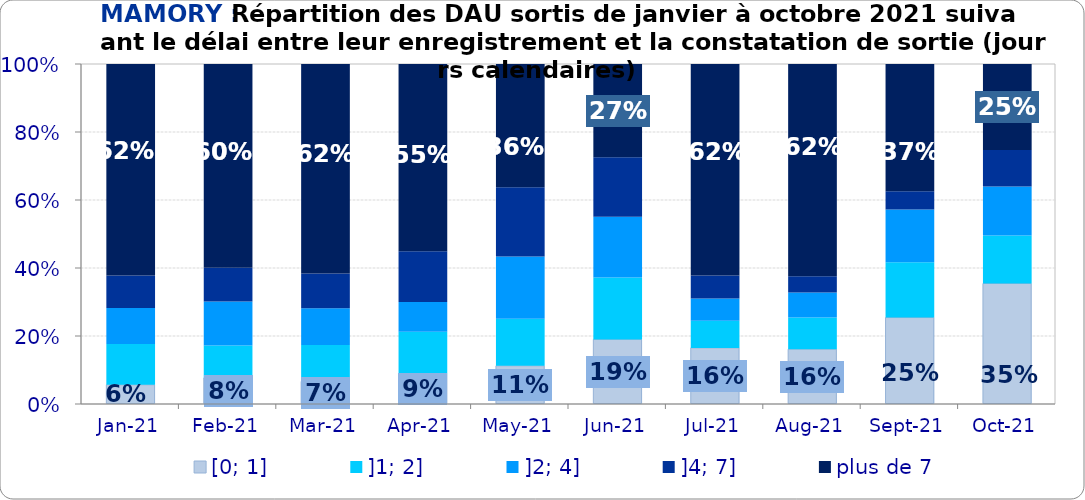
| Category | [0; 1] | ]1; 2] | ]2; 4] | ]4; 7] | plus de 7 |
|---|---|---|---|---|---|
| 2021-01-01 | 0.056 | 0.12 | 0.106 | 0.096 | 0.622 |
| 2021-02-01 | 0.077 | 0.095 | 0.13 | 0.099 | 0.6 |
| 2021-03-01 | 0.066 | 0.107 | 0.108 | 0.102 | 0.616 |
| 2021-04-01 | 0.089 | 0.123 | 0.088 | 0.149 | 0.551 |
| 2021-05-01 | 0.112 | 0.138 | 0.183 | 0.204 | 0.363 |
| 2021-06-01 | 0.19 | 0.182 | 0.179 | 0.175 | 0.274 |
| 2021-07-01 | 0.165 | 0.08 | 0.066 | 0.068 | 0.622 |
| 2021-08-01 | 0.161 | 0.093 | 0.073 | 0.048 | 0.624 |
| 2021-09-01 | 0.254 | 0.163 | 0.155 | 0.054 | 0.374 |
| 2021-10-01 | 0.355 | 0.141 | 0.144 | 0.107 | 0.253 |